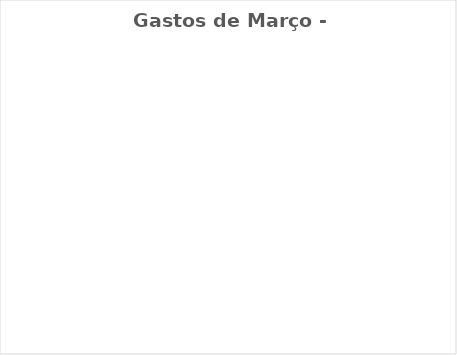
| Category | Gastos de Março - Real |
|---|---|
| Despesas Mensais | 0 |
| Aposentadoria/Pagar à si | 0 |
| Gratidão/ Doação/ Dizimo | 0 |
| Desejos | 0 |
| Dívidas/Investimentos | 0 |